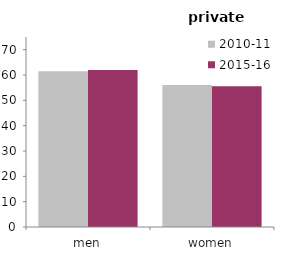
| Category | 2010-11 | 2015-16 |
|---|---|---|
| men | 61.486 | 62.009 |
| women | 56.02 | 55.547 |